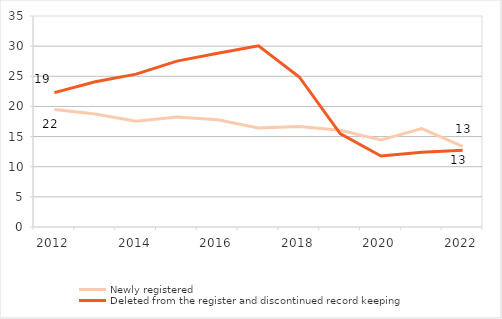
| Category | Newly registered | Deleted from the register and discontinued record keeping |
|---|---|---|
| 2012.0 | 19.49 | 22.291 |
| 2013.0 | 18.755 | 24.097 |
| 2014.0 | 17.538 | 25.36 |
| 2015.0 | 18.251 | 27.516 |
| 2016.0 | 17.78 | 28.832 |
| 2017.0 | 16.411 | 30.047 |
| 2018.0 | 16.682 | 24.89 |
| 2019.0 | 16.045 | 15.506 |
| 2020.0 | 14.457 | 11.787 |
| 2021.0 | 16.328 | 12.403 |
| 2022.0 | 13.374 | 12.715 |